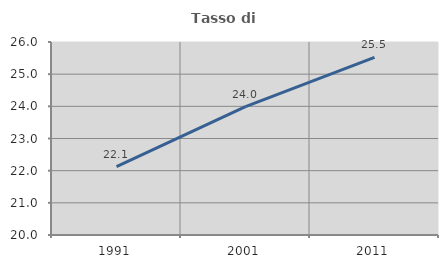
| Category | Tasso di occupazione   |
|---|---|
| 1991.0 | 22.124 |
| 2001.0 | 23.988 |
| 2011.0 | 25.524 |